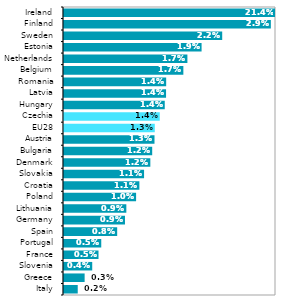
| Category | Series 0 |
|---|---|
| Italy | 0.002 |
| Greece | 0.003 |
| Slovenia | 0.004 |
| France | 0.005 |
| Portugal | 0.005 |
| Spain | 0.008 |
| Germany | 0.009 |
| Lithuania | 0.009 |
| Poland | 0.01 |
| Croatia | 0.011 |
| Slovakia | 0.011 |
| Denmark | 0.012 |
| Bulgaria | 0.012 |
| Austria | 0.013 |
| EU28 | 0.013 |
| Czechia | 0.014 |
| Hungary | 0.014 |
| Latvia | 0.014 |
| Romania | 0.014 |
| Belgium | 0.017 |
| Netherlands | 0.017 |
| Estonia | 0.019 |
| Sweden | 0.022 |
| Finland | 0.029 |
| Ireland | 0.214 |